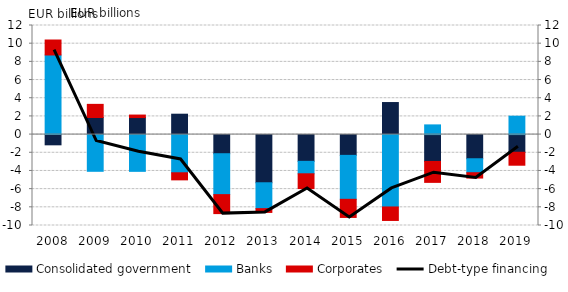
| Category | Consolidated government | Banks | Corporates |
|---|---|---|---|
| 2008.0 | -1.125 | 8.757 | 1.647 |
| 2009.0 | 1.882 | -4.038 | 1.444 |
| 2010.0 | 1.875 | -4.043 | 0.274 |
| 2011.0 | 2.243 | -4.2 | -0.78 |
| 2012.0 | -2.104 | -4.501 | -2.087 |
| 2013.0 | -5.3 | -2.846 | -0.416 |
| 2014.0 | -2.942 | -1.37 | -1.625 |
| 2015.0 | -2.287 | -4.833 | -1.993 |
| 2016.0 | 3.526 | -7.961 | -1.485 |
| 2017.0 | -2.956 | 1.067 | -2.3 |
| 2018.0 | -2.657 | -1.537 | -0.587 |
| 2019.0 | -1.945 | 2.023 | -1.424 |